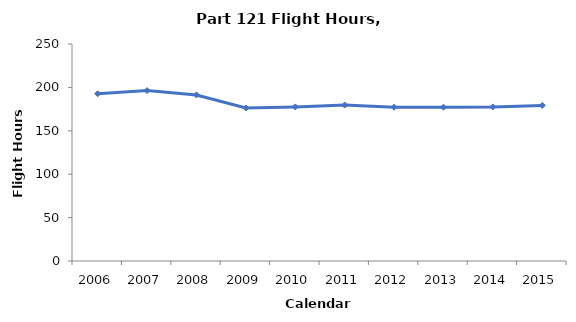
| Category | Flight Hours (100,000s) |
|---|---|
| 2006.0 | 192.632 |
| 2007.0 | 196.373 |
| 2008.0 | 191.268 |
| 2009.0 | 176.268 |
| 2010.0 | 177.51 |
| 2011.0 | 179.63 |
| 2012.0 | 177.222 |
| 2013.0 | 177.18 |
| 2014.0 | 177.52 |
| 2015.0 | 179.286 |